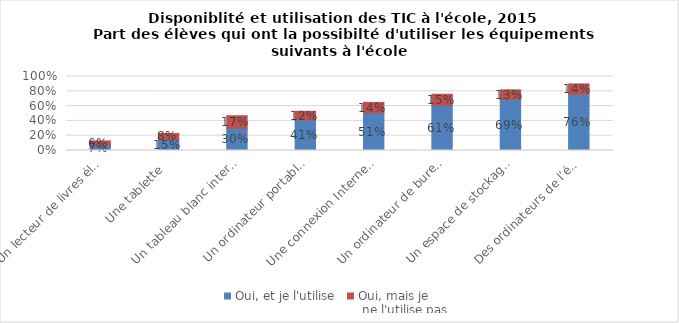
| Category | Oui, et je l'utilise | Oui, mais je
 ne l'utilise pas |
|---|---|---|
| Un lecteur de livres électroniques  | 0.07 | 0.06 |
| Une tablette  | 0.15 | 0.08 |
| Un tableau blanc interactif  | 0.3 | 0.17 |
| Un ordinateur portable   | 0.41 | 0.12 |
| Une connexion Internet WIFI  | 0.51 | 0.14 |
| Un ordinateur de bureau  | 0.61 | 0.15 |
| Un espace de stockage pour des données scolaires  | 0.69 | 0.13 |
| Des ordinateurs de l’école connectés à Internet  | 0.76 | 0.14 |